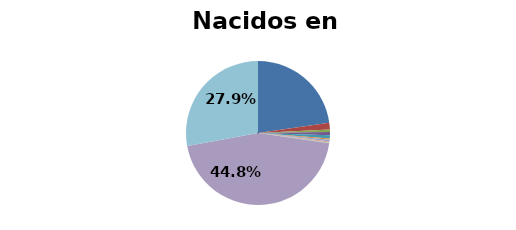
| Category | Nacidos en Venezuela |
|---|---|
| Mapuche | 0.227 |
| Aymara | 0.015 |
| Rapa Nui | 0.006 |
| Lican Antai | 0.007 |
| Quechua | 0.007 |
| Colla | 0.003 |
| Diaguita | 0.004 |
| Kawésqar | 0.002 |
| Yagán o Yámana | 0.002 |
| Otro | 0.448 |
| Pueblo ignorado | 0.279 |